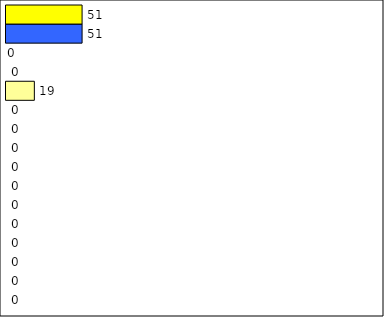
| Category | -2 | -1 | 0 | 1 | 2 | 3 | 4 | 5 | 6 | 7 | 8 | 9 | 10 | 11 | 12 | Perfect Round |
|---|---|---|---|---|---|---|---|---|---|---|---|---|---|---|---|---|
| 0 | 0 | 0 | 0 | 0 | 0 | 0 | 0 | 0 | 0 | 0 | 0 | 19 | 0 | 0 | 51 | 51 |